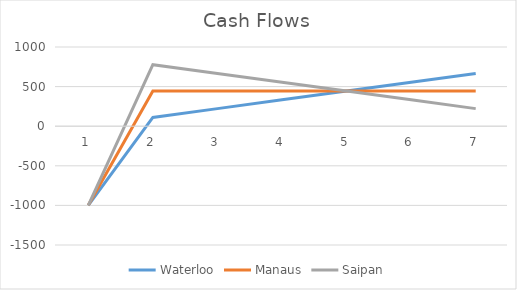
| Category | Waterloo | Manaus | Saipan |
|---|---|---|---|
| 0 | -999 | -999 | -999 |
| 1 | 111 | 444 | 777 |
| 2 | 222 | 444 | 666 |
| 3 | 333 | 444 | 555 |
| 4 | 444 | 444 | 444 |
| 5 | 555 | 444 | 333 |
| 6 | 666 | 444 | 222 |